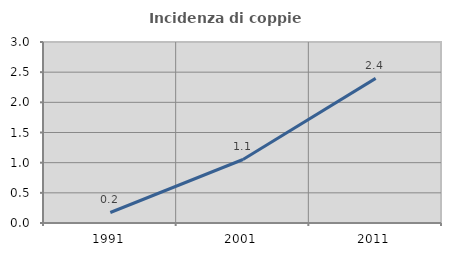
| Category | Incidenza di coppie miste |
|---|---|
| 1991.0 | 0.174 |
| 2001.0 | 1.053 |
| 2011.0 | 2.397 |